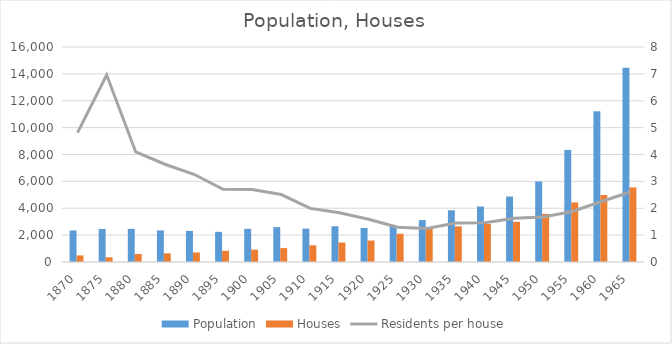
| Category | Population | Houses |
|---|---|---|
| 1870.0 | 2350 | 488 |
| 1875.0 | 2463 | 354 |
| 1880.0 | 2466 | 602 |
| 1885.0 | 2350 | 646 |
| 1890.0 | 2318 | 710 |
| 1895.0 | 2246 | 830 |
| 1900.0 | 2470 | 915 |
| 1905.0 | 2597 | 1035 |
| 1910.0 | 2482 | 1244 |
| 1915.0 | 2661 | 1452 |
| 1920.0 | 2534 | 1596 |
| 1925.0 | 2713 | 2101 |
| 1930.0 | 3118 | 2502 |
| 1935.0 | 3846 | 2650 |
| 1940.0 | 4130 | 2826 |
| 1945.0 | 4873 | 2991 |
| 1950.0 | 5993 | 3582 |
| 1955.0 | 8341 | 4433 |
| 1960.0 | 11214 | 4981 |
| 1965.0 | 14458 | 5548 |